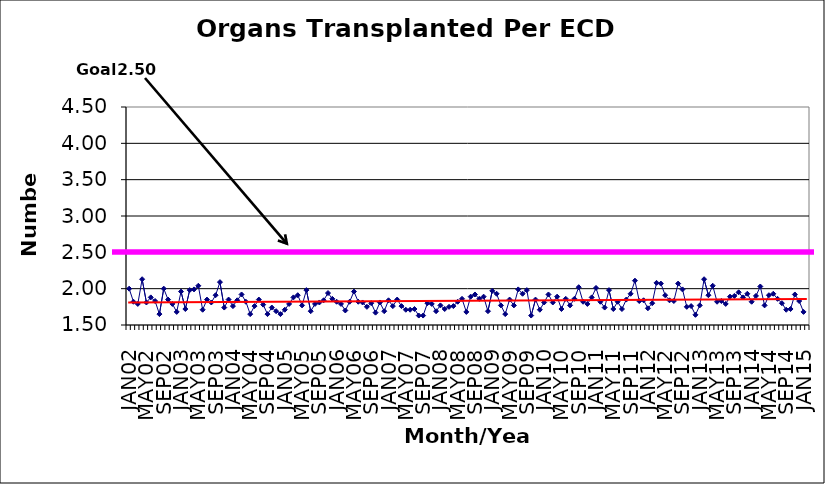
| Category | Series 0 |
|---|---|
| JAN02 | 2 |
| FEB02 | 1.82 |
| MAR02 | 1.79 |
| APR02 | 2.13 |
| MAY02 | 1.81 |
| JUN02 | 1.88 |
| JUL02 | 1.83 |
| AUG02 | 1.65 |
| SEP02 | 2 |
| OCT02 | 1.85 |
| NOV02 | 1.79 |
| DEC02 | 1.68 |
| JAN03 | 1.96 |
| FEB03 | 1.72 |
| MAR03 | 1.98 |
| APR03 | 1.99 |
| MAY03 | 2.04 |
| JUN03 | 1.71 |
| JUL03 | 1.85 |
| AUG03 | 1.81 |
| SEP03 | 1.91 |
| OCT03 | 2.09 |
| NOV03 | 1.74 |
| DEC03 | 1.85 |
| JAN04 | 1.76 |
| FEB04 | 1.84 |
| MAR04 | 1.92 |
| APR04 | 1.82 |
| MAY04 | 1.65 |
| JUN04 | 1.76 |
| JUL04 | 1.85 |
| AUG04 | 1.78 |
| SEP04 | 1.65 |
| OCT04 | 1.74 |
| NOV04 | 1.69 |
| DEC04 | 1.65 |
| JAN05 | 1.71 |
| FEB05 | 1.79 |
| MAR05 | 1.88 |
| APR05 | 1.91 |
| MAY05 | 1.77 |
| JUN05 | 1.98 |
| JUL05 | 1.69 |
| AUG05 | 1.79 |
| SEP05 | 1.81 |
| OCT05 | 1.84 |
| NOV05 | 1.94 |
| DEC05 | 1.86 |
| JAN06 | 1.82 |
| FEB06 | 1.79 |
| MAR06 | 1.7 |
| APR06 | 1.82 |
| MAY06 | 1.96 |
| JUN06 | 1.82 |
| JUL06 | 1.81 |
| AUG06 | 1.75 |
| SEP06 | 1.8 |
| OCT06 | 1.67 |
| NOV06 | 1.81 |
| DEC06 | 1.69 |
| JAN07 | 1.84 |
| FEB07 | 1.76 |
| MAR07 | 1.85 |
| APR07 | 1.76 |
| MAY07 | 1.71 |
| JUN07 | 1.71 |
| JUL07 | 1.72 |
| AUG07 | 1.63 |
| SEP07 | 1.63 |
| OCT07 | 1.8 |
| NOV07 | 1.79 |
| DEC07 | 1.69 |
| JAN08 | 1.77 |
| FEB08 | 1.72 |
| MAR08 | 1.75 |
| APR08 | 1.76 |
| MAY08 | 1.82 |
| JUN08 | 1.86 |
| JUL08 | 1.68 |
| AUG08 | 1.89 |
| SEP08 | 1.92 |
| OCT08 | 1.86 |
| NOV08 | 1.89 |
| DEC08 | 1.69 |
| JAN09 | 1.97 |
| FEB09 | 1.93 |
| MAR09 | 1.77 |
| APR09 | 1.65 |
| MAY09 | 1.85 |
| JUN09 | 1.77 |
| JUL09 | 1.99 |
| AUG09 | 1.93 |
| SEP09 | 1.98 |
| OCT09 | 1.63 |
| NOV09 | 1.85 |
| DEC09 | 1.71 |
| JAN10 | 1.81 |
| FEB10 | 1.92 |
| MAR10 | 1.81 |
| APR10 | 1.89 |
| MAY10 | 1.72 |
| JUN10 | 1.86 |
| JUL10 | 1.77 |
| AUG10 | 1.86 |
| SEP10 | 2.02 |
| OCT10 | 1.82 |
| NOV10 | 1.79 |
| DEC10 | 1.88 |
| JAN11 | 2.01 |
| FEB11 | 1.82 |
| MAR11 | 1.74 |
| APR11 | 1.98 |
| MAY11 | 1.72 |
| JUN11 | 1.82 |
| JUL11 | 1.72 |
| AUG11 | 1.85 |
| SEP11 | 1.93 |
| OCT11 | 2.11 |
| NOV11 | 1.83 |
| DEC11 | 1.84 |
| JAN12 | 1.73 |
| FEB12 | 1.8 |
| MAR12 | 2.08 |
| APR12 | 2.07 |
| MAY12 | 1.91 |
| JUN12 | 1.84 |
| JUL12 | 1.83 |
| AUG12 | 2.07 |
| SEP12 | 1.99 |
| OCT12 | 1.75 |
| NOV12 | 1.76 |
| DEC12 | 1.64 |
| JAN13 | 1.77 |
| FEB13 | 2.13 |
| MAR13 | 1.91 |
| APR13 | 2.04 |
| MAY13 | 1.82 |
| JUN13 | 1.83 |
| JUL13 | 1.79 |
| AUG13 | 1.89 |
| SEP13 | 1.9 |
| OCT13 | 1.95 |
| NOV13 | 1.88 |
| DEC13 | 1.93 |
| JAN14 | 1.82 |
| FEB14 | 1.9 |
| MAR14 | 2.03 |
| APR14 | 1.77 |
| MAY14 | 1.91 |
| JUN14 | 1.93 |
| JUL14 | 1.86 |
| AUG14 | 1.8 |
| SEP14 | 1.71 |
| OCT14 | 1.72 |
| NOV14 | 1.92 |
| DEC14 | 1.83 |
| JAN15 | 1.68 |